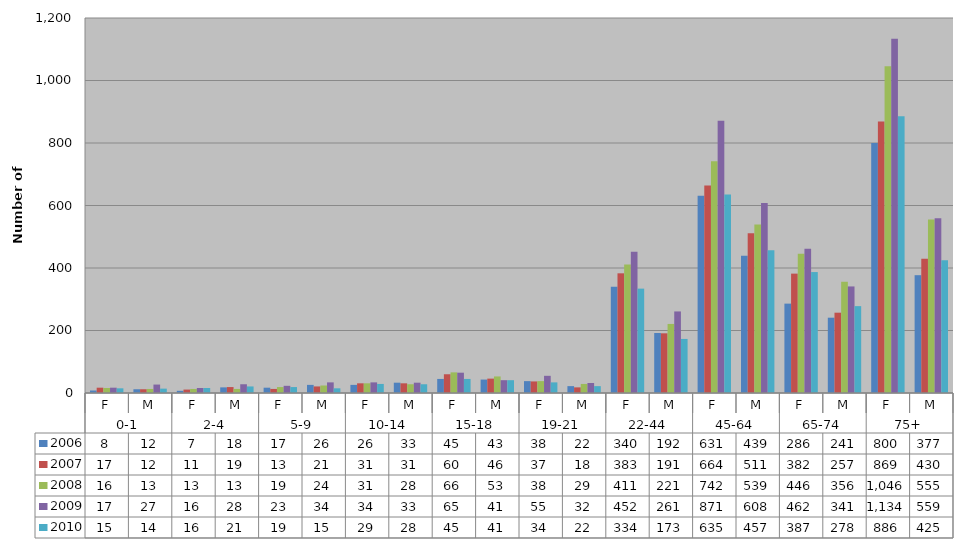
| Category | 2006 | 2007 | 2008 | 2009 | 2010 |
|---|---|---|---|---|---|
| 0 | 8 | 17 | 16 | 17 | 15 |
| 1 | 12 | 12 | 13 | 27 | 14 |
| 2 | 7 | 11 | 13 | 16 | 16 |
| 3 | 18 | 19 | 13 | 28 | 21 |
| 4 | 17 | 13 | 19 | 23 | 19 |
| 5 | 26 | 21 | 24 | 34 | 15 |
| 6 | 26 | 31 | 31 | 34 | 29 |
| 7 | 33 | 31 | 28 | 33 | 28 |
| 8 | 45 | 60 | 66 | 65 | 45 |
| 9 | 43 | 46 | 53 | 41 | 41 |
| 10 | 38 | 37 | 38 | 55 | 34 |
| 11 | 22 | 18 | 29 | 32 | 22 |
| 12 | 340 | 383 | 411 | 452 | 334 |
| 13 | 192 | 191 | 221 | 261 | 173 |
| 14 | 631 | 664 | 742 | 871 | 635 |
| 15 | 439 | 511 | 539 | 608 | 457 |
| 16 | 286 | 382 | 446 | 462 | 387 |
| 17 | 241 | 257 | 356 | 341 | 278 |
| 18 | 800 | 869 | 1046 | 1134 | 886 |
| 19 | 377 | 430 | 555 | 559 | 425 |